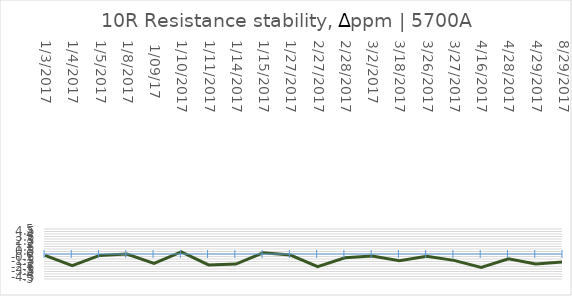
| Category | Series 0 |
|---|---|
| 1/3/2017 | -0.27 |
| 1/4/2017 | -2.34 |
| 1/5/2017 | -0.29 |
| 1/8/2017 | 0 |
|  1/09/17 | -1.89 |
| 1/10/2017 | 0.41 |
| 1/11/2017 | -2.18 |
| 1/14/2017 | -2.02 |
| 1/15/2017 | 0.23 |
| 1/27/2017 | -0.2 |
| 2/27/2017 | -2.52 |
| 2/28/2017 | -0.77 |
| 3/2/2017 | -0.41 |
| 3/18/2017 | -1.36 |
| 3/26/2017 | -0.45 |
| 3/27/2017 | -1.27 |
| 4/16/2017 | -2.71 |
| 4/28/2017 | -0.97 |
| 4/29/2017 | -2.01 |
| 8/29/2017 | -1.58 |